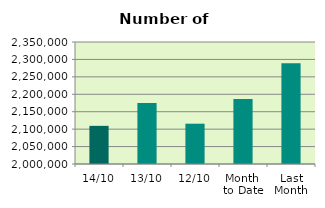
| Category | Series 0 |
|---|---|
| 14/10 | 2109438 |
| 13/10 | 2175168 |
| 12/10 | 2115598 |
| Month 
to Date | 2186540.4 |
| Last
Month | 2288803 |